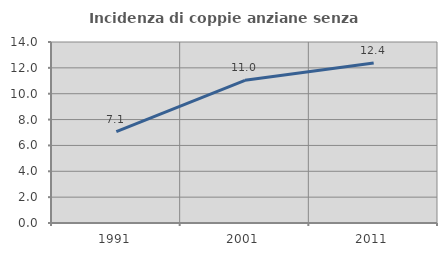
| Category | Incidenza di coppie anziane senza figli  |
|---|---|
| 1991.0 | 7.073 |
| 2001.0 | 11.038 |
| 2011.0 | 12.382 |